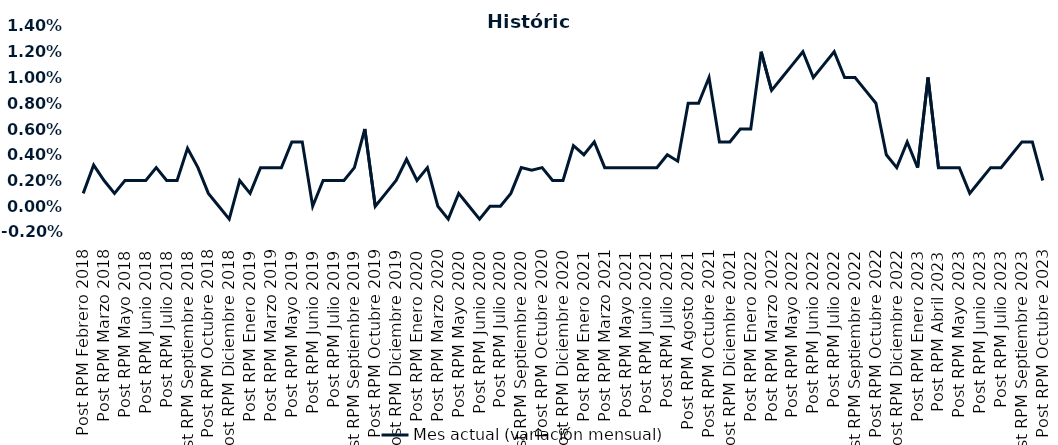
| Category | Mes actual (variación mensual)  |
|---|---|
| Post RPM Febrero 2018 | 0.001 |
| Pre RPM Marzo 2018 | 0.003 |
| Post RPM Marzo 2018 | 0.002 |
| Pre RPM Mayo 2018 | 0.001 |
| Post RPM Mayo 2018 | 0.002 |
| Pre RPM Junio 2018 | 0.002 |
| Post RPM Junio 2018 | 0.002 |
| Pre RPM Julio 2018 | 0.003 |
| Post RPM Julio 2018 | 0.002 |
| Pre RPM Septiembre 2018 | 0.002 |
| Post RPM Septiembre 2018 | 0.004 |
| Pre RPM Octubre 2018 | 0.003 |
| Post RPM Octubre 2018 | 0.001 |
| Pre RPM Diciembre 2018 | 0 |
| Post RPM Diciembre 2018 | -0.001 |
| Pre RPM Enero 2019 | 0.002 |
| Post RPM Enero 2019 | 0.001 |
| Pre RPM Marzo 2019 | 0.003 |
| Post RPM Marzo 2019 | 0.003 |
| Pre RPM Mayo 2019 | 0.003 |
| Post RPM Mayo 2019 | 0.005 |
| Pre RPM Junio 2019 | 0.005 |
| Post RPM Junio 2019 | 0 |
| Pre RPM Julio 2019 | 0.002 |
| Post RPM Julio 2019 | 0.002 |
| Pre RPM Septiembre 2019 | 0.002 |
| Post RPM Septiembre 2019 | 0.003 |
| Pre RPM Octubre 2019 | 0.006 |
| Post RPM Octubre 2019 | 0 |
| Pre RPM Diciembre 2019 | 0.001 |
| Post RPM Diciembre 2019 | 0.002 |
| Pre RPM Enero 2020 | 0.004 |
| Post RPM Enero 2020 | 0.002 |
| Pre RPM Marzo 2020 | 0.003 |
| Post RPM Marzo 2020 | 0 |
| Pre RPM Mayo 2020 | -0.001 |
| Post RPM Mayo 2020 | 0.001 |
| Pre RPM Junio 2020 | 0 |
| Post RPM Junio 2020 | -0.001 |
| Pre RPM Julio 2020 | 0 |
| Post RPM Julio 2020 | 0 |
| Pre RPM Septiembre 2020 | 0.001 |
| Post RPM Septiembre 2020 | 0.003 |
| Pre RPM Octubre 2020 | 0.003 |
| Post RPM Octubre 2020 | 0.003 |
| Pre RPM Diciembre 2020 | 0.002 |
| Post RPM Diciembre 2020 | 0.002 |
| Pre RPM Enero 2021 | 0.005 |
| Post RPM Enero 2021 | 0.004 |
| Pre RPM Marzo 2021 | 0.005 |
| Post RPM Marzo 2021 | 0.003 |
| Pre RPM Mayo 2021 | 0.003 |
| Post RPM Mayo 2021 | 0.003 |
| Pre RPM Junio 2021 | 0.003 |
| Post RPM Junio 2021 | 0.003 |
| Pre RPM Julio 2021 | 0.003 |
| Post RPM Julio 2021 | 0.004 |
| Pre RPM Agosto 2021 | 0.004 |
| Post RPM Agosto 2021 | 0.008 |
| Pre RPM Octubre 2021 | 0.008 |
| Post RPM Octubre 2021 | 0.01 |
| Pre RPM Diciembre 2021 | 0.005 |
| Post RPM Diciembre 2021 | 0.005 |
| Pre RPM Enero 2022 | 0.006 |
| Post RPM Enero 2022 | 0.006 |
| Pre RPM Marzo 2022 | 0.012 |
| Post RPM Marzo 2022 | 0.009 |
| Pre RPM Mayo 2022 | 0.01 |
| Post RPM Mayo 2022 | 0.011 |
| Pre RPM Junio 2022 | 0.012 |
| Post RPM Junio 2022 | 0.01 |
| Pre RPM Julio 2022 | 0.011 |
| Post RPM Julio 2022 | 0.012 |
| Pre RPM Septiembre 2022 | 0.01 |
| Post RPM Septiembre 2022 | 0.01 |
| Pre RPM Octubre 2022 | 0.009 |
| Post RPM Octubre 2022 | 0.008 |
| Pre RPM Diciembre 2022 | 0.004 |
| Post RPM Diciembre 2022 | 0.003 |
| Pre RPM Enero 2023 | 0.005 |
| Post RPM Enero 2023 | 0.003 |
| Pre RPM Abril 2023 | 0.01 |
| Post RPM Abril 2023 | 0.003 |
| Pre RPM Mayo 2023 | 0.003 |
| Post RPM Mayo 2023 | 0.003 |
| Pre RPM Junio 2023 | 0.001 |
| Post RPM Junio 2023 | 0.002 |
| Pre RPM Julio 2023 | 0.003 |
| Post RPM Julio 2023 | 0.003 |
| Pre RPM Septiembre 2023 | 0.004 |
| Post RPM Septiembre 2023 | 0.005 |
| Pre RPM Octubre 2023 | 0.005 |
| Post RPM Octubre 2023 | 0.002 |